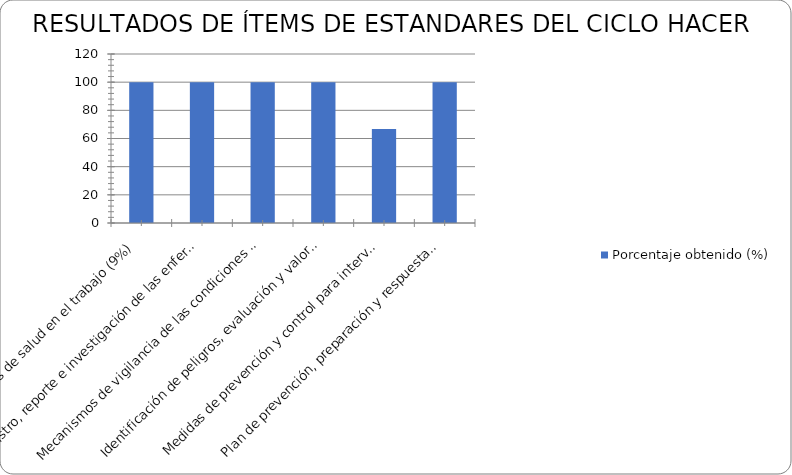
| Category | Porcentaje obtenido (%) |
|---|---|
| Condiciones de salud en el trabajo (9%) | 100 |
| Registro, reporte e investigación de las enfermedades laborales, los incidentes y accidentes del trabajo (5%) | 100 |
| Mecanismos de vigilancia de las condiciones de salud de los trabajadores (6%) | 100 |
| Identificación de peligros, evaluación y valoración de los riesgos (15%) | 100 |
| Medidas de prevención y control para intervenir los peligros /riesgos (15%) | 66.67 |
| Plan de prevención, preparación y respuesta ante emergencias (10%) | 100 |